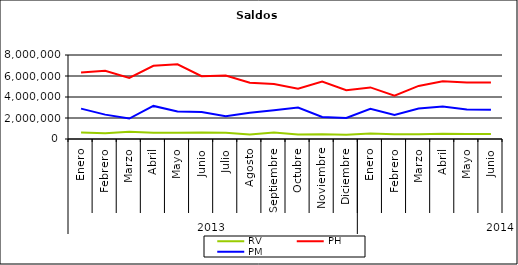
| Category | RV | PH | PM |
|---|---|---|---|
| 0 | 625726.624 | 6338490.057 | 2894951.851 |
| 1 | 552164.14 | 6505711.807 | 2320902.81 |
| 2 | 684317.675 | 5822855.149 | 1948127.804 |
| 3 | 601474.166 | 6976391.987 | 3151453.143 |
| 4 | 590050.657 | 7107878.906 | 2620515.735 |
| 5 | 624993.58 | 5975534.656 | 2574055.31 |
| 6 | 600696.535 | 6050025.472 | 2173848.831 |
| 7 | 419012.816 | 5367684.924 | 2503871.717 |
| 8 | 611730.758 | 5247250.768 | 2727549.288 |
| 9 | 419155.215 | 4784420.625 | 2990459.774 |
| 10 | 447319.577 | 5481772.72 | 2092491.866 |
| 11 | 408611.698 | 4646492.747 | 1999878.157 |
| 12 | 527889.485 | 4912075.273 | 2877652.76 |
| 13 | 454567.098 | 4120538.063 | 2278357.683 |
| 14 | 451499.2 | 5057360.029 | 2895505.472 |
| 15 | 496328.639 | 5498657.25 | 3083378.882 |
| 16 | 484463.452 | 5384146.137 | 2812191.042 |
| 17 | 465266.869 | 5373295.415 | 2775261.669 |